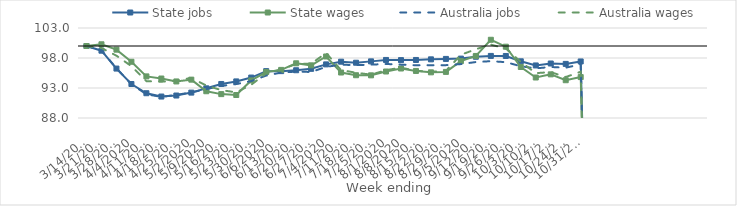
| Category | State jobs | State wages | Australia jobs | Australia wages |
|---|---|---|---|---|
| 14/03/2020 | 100 | 100 | 100 | 100 |
| 21/03/2020 | 99.22 | 100.285 | 99.261 | 99.662 |
| 28/03/2020 | 96.238 | 99.389 | 96.28 | 98.386 |
| 04/04/2020 | 93.666 | 97.374 | 93.636 | 96.64 |
| 11/04/2020 | 92.129 | 94.933 | 91.95 | 94.142 |
| 18/04/2020 | 91.576 | 94.58 | 91.517 | 94.044 |
| 25/04/2020 | 91.746 | 94.094 | 91.861 | 94.24 |
| 02/05/2020 | 92.233 | 94.391 | 92.261 | 94.675 |
| 09/05/2020 | 92.945 | 92.458 | 92.816 | 93.417 |
| 16/05/2020 | 93.671 | 91.981 | 93.349 | 92.645 |
| 23/05/2020 | 94.098 | 91.833 | 93.653 | 92.27 |
| 30/05/2020 | 94.74 | 94.264 | 94.153 | 93.543 |
| 06/06/2020 | 95.81 | 95.662 | 95.073 | 95.449 |
| 13/06/2020 | 95.812 | 96.018 | 95.572 | 96.097 |
| 20/06/2020 | 95.958 | 97.117 | 95.727 | 96.992 |
| 27/06/2020 | 96.195 | 96.777 | 95.674 | 97.05 |
| 04/07/2020 | 96.936 | 98.254 | 96.519 | 98.837 |
| 11/07/2020 | 97.384 | 95.581 | 96.892 | 95.976 |
| 18/07/2020 | 97.213 | 95.13 | 96.803 | 95.549 |
| 25/07/2020 | 97.438 | 95.11 | 96.894 | 95.223 |
| 01/08/2020 | 97.676 | 95.748 | 97.004 | 95.974 |
| 08/08/2020 | 97.648 | 96.25 | 96.893 | 96.39 |
| 15/08/2020 | 97.672 | 95.841 | 96.793 | 95.878 |
| 22/08/2020 | 97.776 | 95.61 | 96.797 | 95.7 |
| 29/08/2020 | 97.846 | 95.683 | 96.807 | 95.852 |
| 05/09/2020 | 97.898 | 97.483 | 96.983 | 98.536 |
| 12/09/2020 | 98.209 | 98.342 | 97.328 | 99.459 |
| 19/09/2020 | 98.347 | 101.038 | 97.472 | 100.228 |
| 26/09/2020 | 98.337 | 99.884 | 97.305 | 99.582 |
| 03/10/2020 | 97.448 | 96.502 | 96.626 | 97.348 |
| 10/10/2020 | 96.758 | 94.748 | 96.269 | 95.474 |
| 17/10/2020 | 97.083 | 95.274 | 96.502 | 95.648 |
| 24/10/2020 | 97.017 | 94.296 | 96.383 | 94.829 |
| 31/10/2020 | 97.423 | 94.82 | 96.953 | 95.711 |